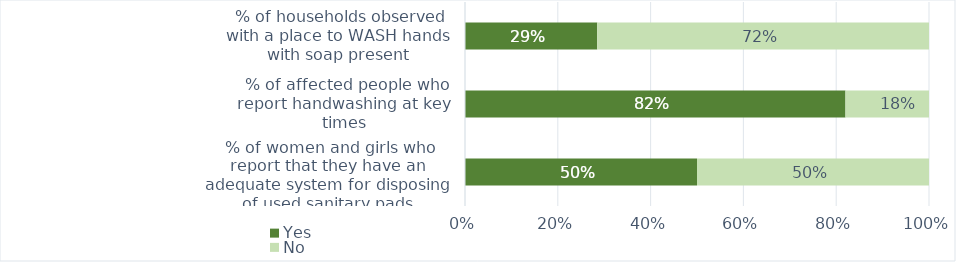
| Category | Yes | No |
|---|---|---|
|  % of women and girls who report that they have an adequate system for disposing of used sanitary pads | 0.5 | 0.5 |
|  % of affected people who report handwashing at key times | 0.82 | 0.18 |
|  % of households observed with a place to WASH hands with soap present | 0.285 | 0.715 |